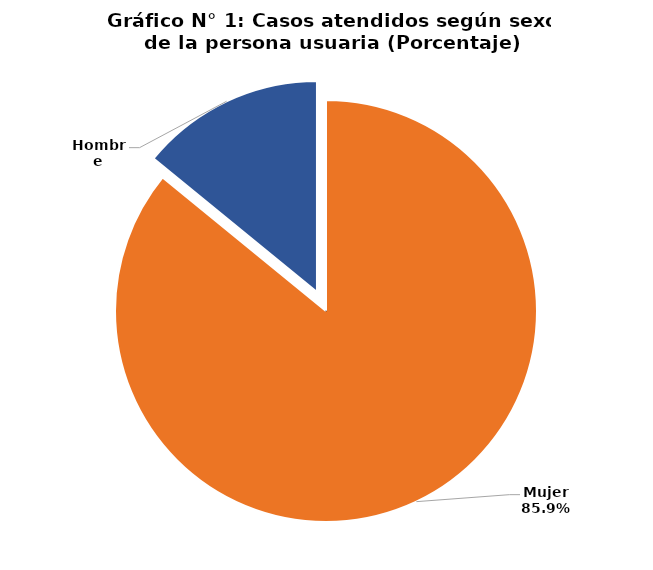
| Category | Series 0 |
|---|---|
| Mujer | 129473 |
| Hombre | 21242 |